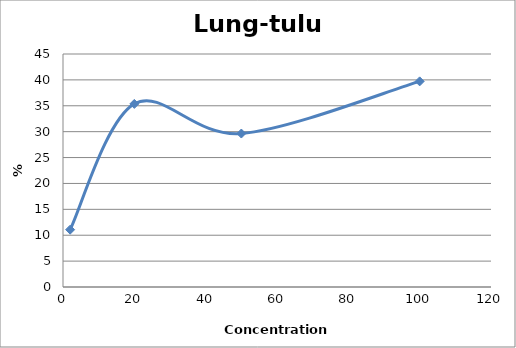
| Category | Lung-tulu4 |
|---|---|
| 100.0 | 39.714 |
| 50.0 | 29.64 |
| 20.0 | 35.36 |
| 2.0 | 11.071 |
| nan | 0 |
| nan | 0 |
| nan | 0 |
| nan | 0 |
| nan | 0 |